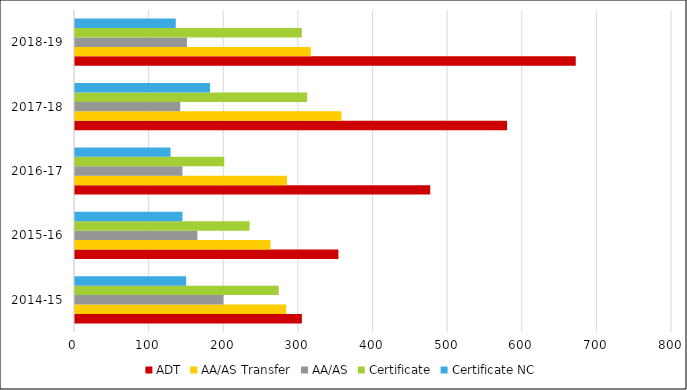
| Category | ADT | AA/AS Transfer | AA/AS | Certificate | Certificate NC |
|---|---|---|---|---|---|
| 2014-15 | 304 | 283 | 199 | 273 | 149 |
| 2015-16 | 353 | 262 | 164 | 234 | 144 |
| 2016-17 | 476 | 284 | 144 | 200 | 128 |
| 2017-18 | 579 | 357 | 141 | 311 | 181 |
| 2018-19 | 671 | 316 | 150 | 304 | 135 |